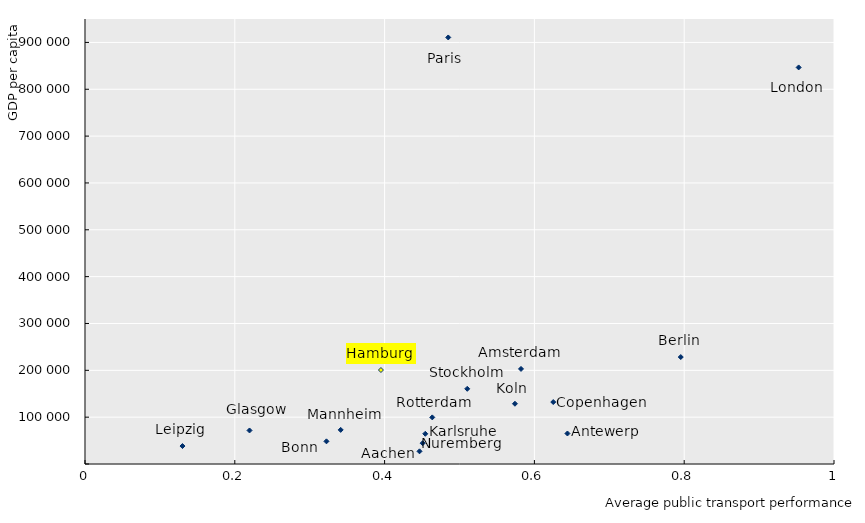
| Category | Series 0 |
|---|---|
| 0.795408677866576 | 228330 |
| 0.3951106 | 200628 |
| 0.574053 | 128624 |
| 0.1301412 | 38354 |
| 0.4543035 | 64520 |
| 0.3223619 | 48384 |
| 0.4508024 | 44410 |
| 0.341366 | 72787 |
| 0.446597 | 27069 |
| 0.5821217 | 202955 |
| 0.4636416 | 99523 |
| 0.5103441 | 160522 |
| 0.644128673108099 | 65123 |
| 0.6251838 | 132281 |
| 0.952832 | 846598 |
| 0.2196636 | 71577 |
| 0.4849798 | 910598 |